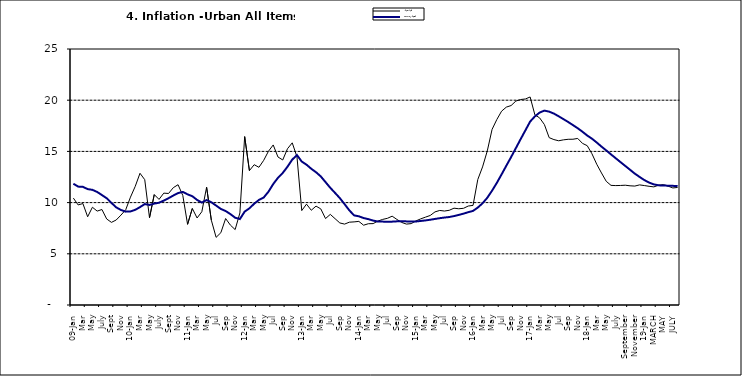
| Category | Year-on Rate | 12-Month Average |
|---|---|---|
| 09-Jan | 10.439 | 11.844 |
| Feb | 9.772 | 11.562 |
| Mar | 9.907 | 11.538 |
| Apr | 8.618 | 11.319 |
| May | 9.547 | 11.246 |
| June | 9.17 | 11.039 |
| July | 9.325 | 10.738 |
| Aug | 8.401 | 10.424 |
| Sept | 8.07 | 9.973 |
| Oct | 8.3 | 9.535 |
| Nov | 8.781 | 9.278 |
| Dec | 9.298 | 9.117 |
| 10-Jan | 10.534 | 9.136 |
| Feb | 11.584 | 9.297 |
| Mar | 12.864 | 9.555 |
| Apr | 12.24 | 9.859 |
| May | 8.524 | 9.769 |
| June | 10.781 | 9.904 |
| July | 10.313 | 9.987 |
| Aug | 10.924 | 10.197 |
| Sept | 10.891 | 10.43 |
| Oct | 11.457 | 10.689 |
| Nov | 11.748 | 10.932 |
| Dec | 10.699 | 11.042 |
| 11-Jan | 7.878 | 10.806 |
| Feb | 9.426 | 10.623 |
| Mar | 8.498 | 10.26 |
| Apr | 9.11 | 10.005 |
| May | 11.5 | 10.249 |
| Jun | 8.278 | 10.034 |
| Jul | 6.608 | 9.711 |
| Aug | 7.061 | 9.38 |
| Sep | 8.443 | 9.178 |
| Oct | 7.802 | 8.88 |
| Nov | 7.365 | 8.525 |
| Dec | 8.993 | 8.395 |
| 12-Jan | 16.445 | 9.119 |
| Feb | 13.123 | 9.443 |
| Mar | 13.701 | 9.889 |
| Apr | 13.447 | 10.259 |
| May | 14.127 | 10.496 |
| Jun | 15.012 | 11.062 |
| Jul | 15.63 | 11.81 |
| Aug | 14.456 | 12.422 |
| Sep | 14.162 | 12.893 |
| Oct | 15.26 | 13.506 |
| Nov | 15.836 | 14.199 |
| Dec | 14.459 | 14.637 |
| 13-Jan | 9.22 | 14.006 |
| Feb | 9.85 | 13.703 |
| Mar | 9.253 | 13.302 |
| Apr | 9.657 | 12.966 |
| May | 9.385 | 12.557 |
| Jun | 8.441 | 11.999 |
| Jul | 8.849 | 11.443 |
| Aug | 8.431 | 10.946 |
| Sep | 8.013 | 10.44 |
| Oct | 7.9 | 9.849 |
| Nov | 8.086 | 9.245 |
| Dec | 8.117 | 8.75 |
| 14-Jan | 8.164 | 8.662 |
| Feb | 7.791 | 8.493 |
| Mar | 7.937 | 8.384 |
| Apr | 7.947 | 8.246 |
| May | 8.195 | 8.151 |
| Jun | 8.358 | 8.146 |
| Jul | 8.464 | 8.118 |
| Aug | 8.673 | 8.141 |
| Sep | 8.357 | 8.17 |
| Oct | 8.064 | 8.182 |
| Nov | 7.902 | 8.165 |
| Dec | 7.948 | 8.151 |
| 15-Jan | 8.211 | 8.155 |
| Feb | 8.412 | 8.206 |
| Mar | 8.579 | 8.26 |
| Apr | 8.742 | 8.326 |
| May | 9.092 | 8.403 |
| Jun | 9.232 | 8.478 |
| Jul | 9.177 | 8.54 |
| Aug | 9.25 | 8.591 |
| Sep | 9.455 | 8.684 |
| Oct | 9.398 | 8.795 |
| Nov | 9.442 | 8.922 |
| Dec | 9.665 | 9.064 |
| 16-Jan | 9.728 | 9.19 |
| Feb | 12.254 | 9.516 |
| Mar | 13.485 | 9.935 |
| Apr | 15.052 | 10.474 |
| May | 17.148 | 11.165 |
| Jun | 18.111 | 11.925 |
| Jul | 18.927 | 12.754 |
| Aug | 19.325 | 13.605 |
| Sep | 19.476 | 14.444 |
| Oct | 19.914 | 15.318 |
| Nov | 20.067 | 16.193 |
| Dec | 20.118 | 17.05 |
| 17-Jan | 20.315 | 17.914 |
| Feb | 18.569 | 18.418 |
| Mar | 18.27 | 18.794 |
| Apr | 17.621 | 18.982 |
| May | 16.343 | 18.883 |
| Jun | 16.153 | 18.692 |
| Jul | 16.038 | 18.43 |
| Aug | 16.128 | 18.151 |
| Sep | 16.183 | 17.872 |
| Oct | 16.187 | 17.567 |
| Nov | 16.267 | 17.264 |
| Dec | 15.785 | 16.921 |
| 18-Jan | 15.559 | 16.55 |
| Feb | 14.763 | 16.241 |
| Mar | 13.748 | 15.866 |
| Apr | 12.893 | 15.468 |
| May | 12.077 | 15.096 |
| June | 11.683 | 14.706 |
| July | 11.661 | 14.329 |
| August | 11.673 | 13.951 |
| September | 11.697 | 13.578 |
| October | 11.64 | 13.206 |
| November | 11.615 | 12.831 |
| December | 11.731 | 12.509 |
| 19-Jan | 11.664 | 12.203 |
| February | 11.592 | 11.954 |
| MARCH | 11.535 | 11.78 |
| APRIL | 11.696 | 11.686 |
| MAY | 11.756 | 11.662 |
| JUNE | 11.605 | 11.655 |
| JULY | 11.432 | 11.635 |
| AUGUST | 11.479 | 11.618 |